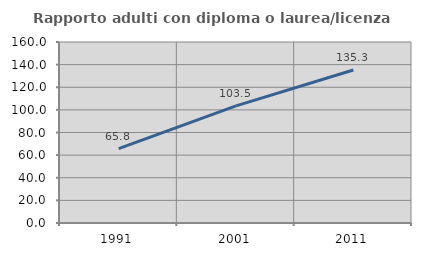
| Category | Rapporto adulti con diploma o laurea/licenza media  |
|---|---|
| 1991.0 | 65.789 |
| 2001.0 | 103.518 |
| 2011.0 | 135.263 |